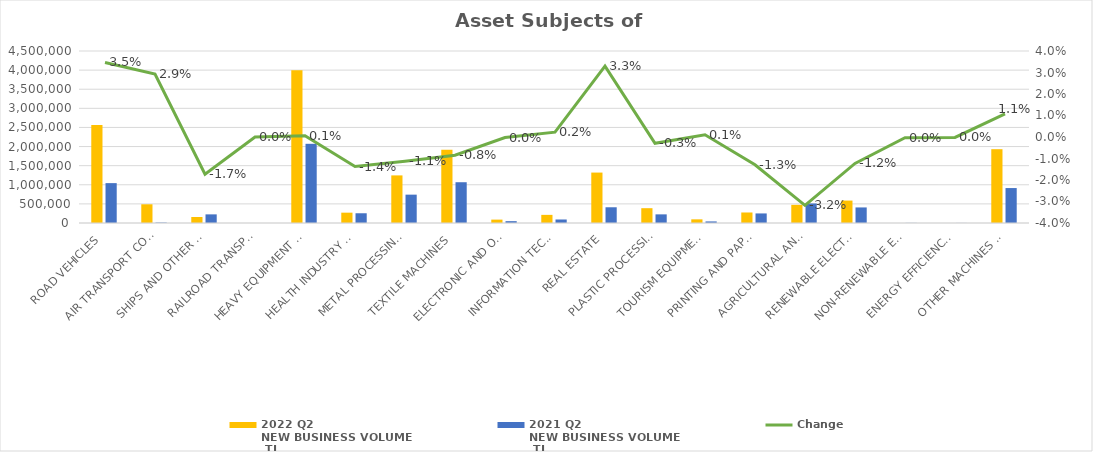
| Category | 2022 Q2 
NEW BUSINESS VOLUME
 TL | 2021 Q2 
NEW BUSINESS VOLUME
 TL |
|---|---|---|
| ROAD VEHICLES | 2561742.639 | 1043165.086 |
| AIR TRANSPORT CONVEYANCE | 489450 | 11001 |
| SHIPS AND OTHER SEA-GOING VESSELS | 157073.45 | 225904.444 |
| RAILROAD TRANSPORT VEHICLES | 0 | 0 |
| HEAVY EQUIPMENT AND CONSTRUCTION MACHINERY | 3994553.274 | 2071828.526 |
| HEALTH INDUSTRY AND AESTHETIC INSTRUMENTS | 270440.581 | 254809.379 |
| METAL PROCESSING MACHINE | 1245471.901 | 741737.497 |
| TEXTILE MACHINES | 1916463.133 | 1066761.487 |
| ELECTRONIC AND OPTICAL DEVICES | 88711.345 | 48094.247 |
| INFORMATION TECHNOLOGIES AND OFFICE SYSTEMS | 212769.996 | 91734.287 |
| REAL ESTATE | 1319346.568 | 411670.224 |
| PLASTIC PROCESSING MACHINES | 387369.645 | 225961.195 |
| TOURISM EQUIPMENT | 95714.34 | 41216.443 |
| PRINTING AND PAPER PROCESSING MACHINES | 275103.573 | 250322.133 |
| AGRICULTURAL AND LIVESTOCK FARMING MACHINES | 474855.981 | 511433.156 |
| RENEWABLE ELECTRICITY GENERATION | 586679.66 | 407364.193 |
| NON-RENEWABLE ELECTRIC ENERGY GENERATION | 0 | 2857 |
| ENERGY EFFICIENCY EQUIPMENT | 0 | 1615.427 |
| OTHER MACHINES AND EQUIPMENT | 1931053.952 | 914299.381 |